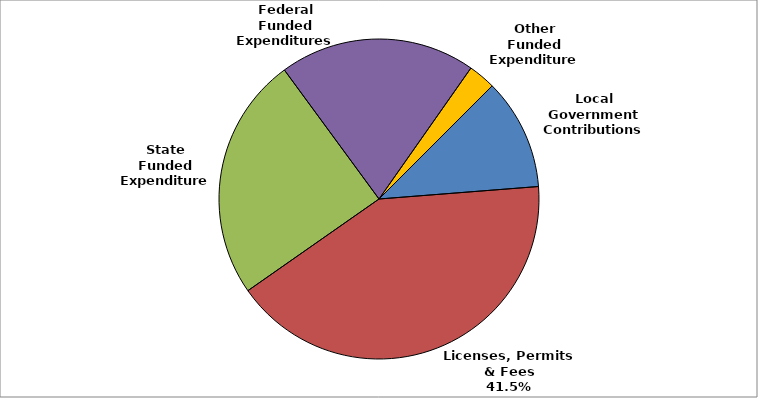
| Category | Series 0 |
|---|---|
| Local Government Contributions | 0.113 |
| Licenses, Permits & Fees | 0.415 |
| State Funded Expenditures | 0.246 |
| Federal Funded Expenditures | 0.198 |
| Other Funded Expenditures | 0.028 |